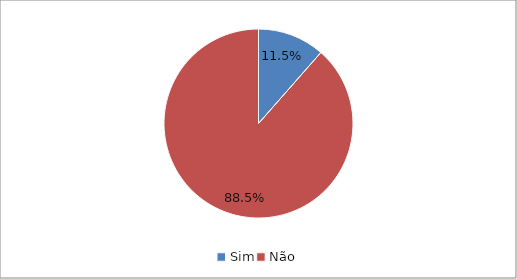
| Category | Series 0 |
|---|---|
| Sim | 0.115 |
| Não | 0.885 |